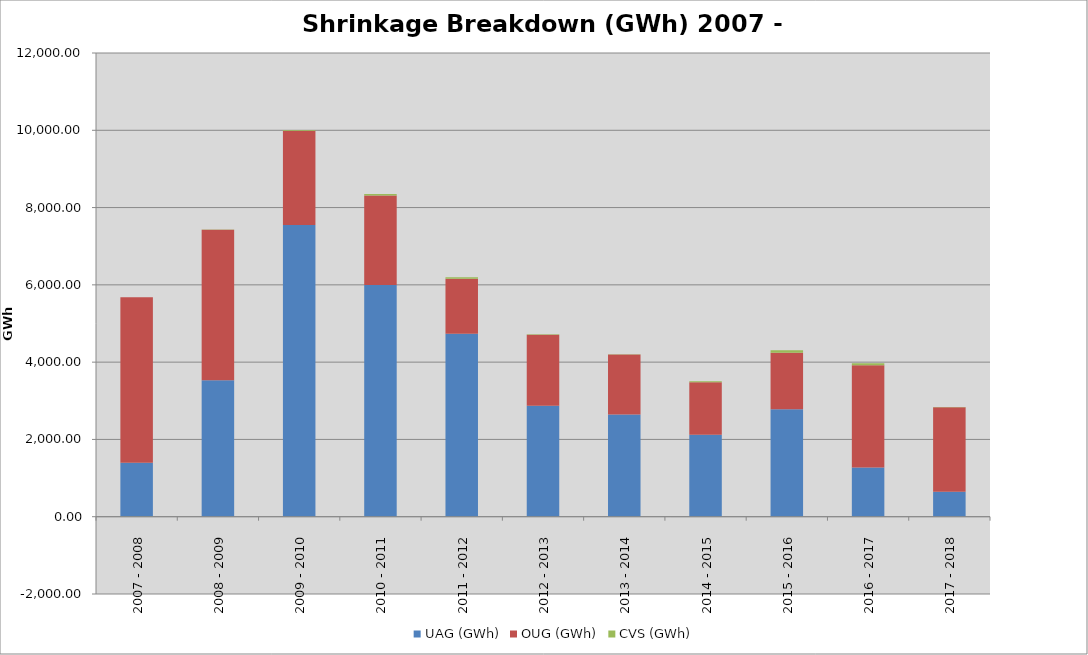
| Category | UAG (GWh) | OUG (GWh) | CVS (GWh) |
|---|---|---|---|
| 2007 - 2008 | 1398.285 | 4278.392 | -4.579 |
| 2008 - 2009 | 3530.957 | 3893.886 | 7.733 |
| 2009 - 2010 | 7550.984 | 2436.968 | 21.544 |
| 2010 - 2011 | 5995.931 | 2316.569 | 41.687 |
| 2011 - 2012 | 4736.63 | 1420.093 | 42.855 |
| 2012 - 2013 | 2873.58 | 1834.959 | 15.137 |
| 2013 - 2014 | 2648.01 | 1548.032 | 5.803 |
| 2014 - 2015 | 2121.263 | 1357.73 | 27.039 |
| 2015 - 2016 | 2782.234 | 1457.817 | 70.93 |
| 2016 - 2017 | 1271.669 | 2649.964 | 50.614 |
| 2017 - 2018 | 643.285 | 2187.924 | 9.718 |